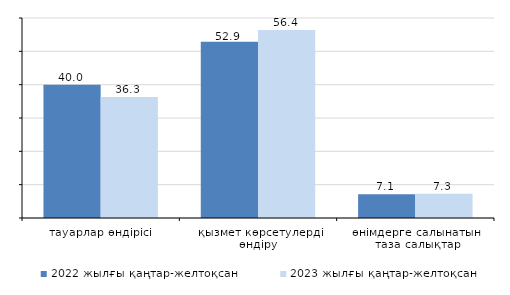
| Category | 2022 жылғы қаңтар-желтоқсан | 2023 жылғы қаңтар-желтоқсан |
|---|---|---|
| тауарлар өндірісі | 40 | 36.3 |
| қызмет көрсетулерді өндіру | 52.9 | 56.4 |
| өнімдерге салынатын  таза салықтар | 7.1 | 7.3 |